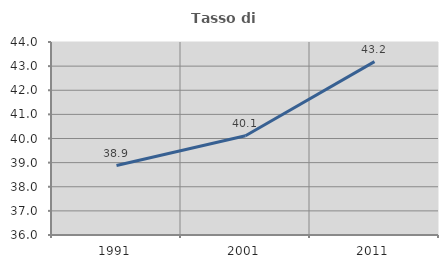
| Category | Tasso di occupazione   |
|---|---|
| 1991.0 | 38.878 |
| 2001.0 | 40.113 |
| 2011.0 | 43.188 |